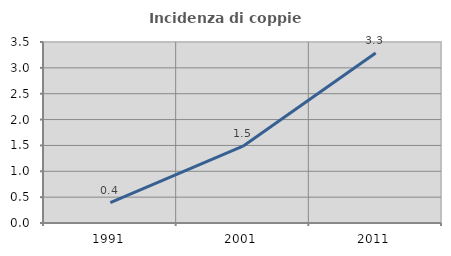
| Category | Incidenza di coppie miste |
|---|---|
| 1991.0 | 0.393 |
| 2001.0 | 1.484 |
| 2011.0 | 3.286 |